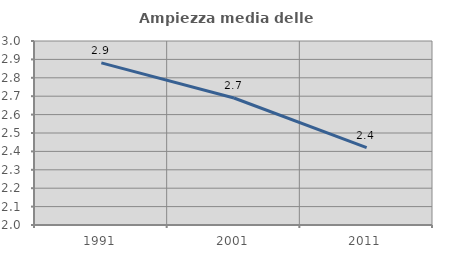
| Category | Ampiezza media delle famiglie |
|---|---|
| 1991.0 | 2.881 |
| 2001.0 | 2.69 |
| 2011.0 | 2.421 |